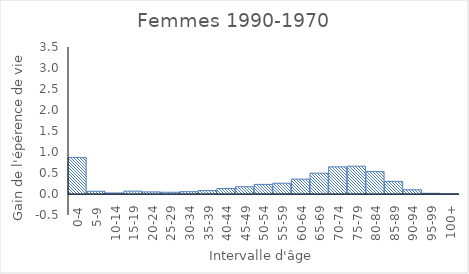
| Category | Femmes |
|---|---|
| 0-4 | 0.867 |
| 5-9 | 0.064 |
| 10-14 | 0.024 |
| 15-19 | 0.068 |
| 20-24 | 0.05 |
| 25-29 | 0.042 |
| 30-34 | 0.055 |
| 35-39 | 0.082 |
| 40-44 | 0.13 |
| 45-49 | 0.173 |
| 50-54 | 0.229 |
| 55-59 | 0.257 |
| 60-64 | 0.354 |
| 65-69 | 0.496 |
| 70-74 | 0.646 |
| 75-79 | 0.66 |
| 80-84 | 0.533 |
| 85-89 | 0.3 |
| 90-94 | 0.101 |
| 95-99 | 0.017 |
| 100+ | 0.001 |